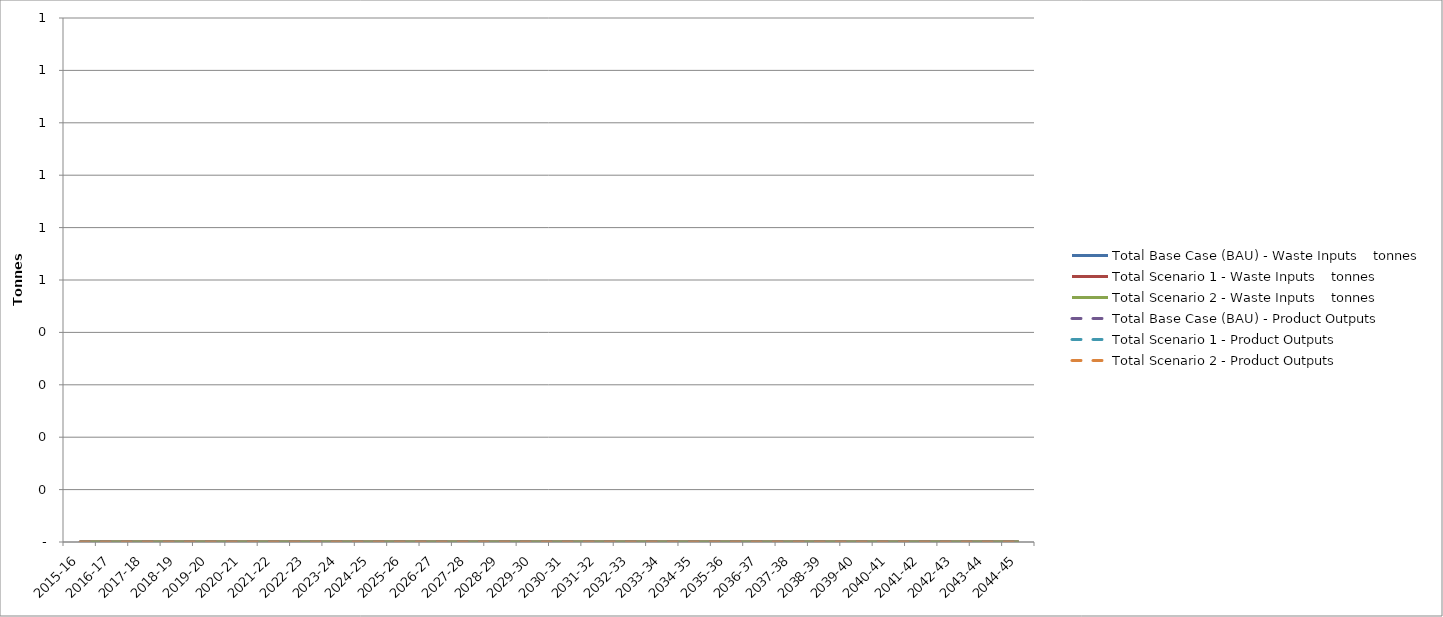
| Category | Total Base Case (BAU) - Waste Inputs | Total Scenario 1 - Waste Inputs | Total Scenario 2 - Waste Inputs | Total Base Case (BAU) - Product Outputs | Total Scenario 1 - Product Outputs | Total Scenario 2 - Product Outputs |
|---|---|---|---|---|---|---|
| 2015-16 | 0 | 0 | 0 | 0 | 0 | 0 |
| 2016-17 | 0 | 0 | 0 | 0 | 0 | 0 |
| 2017-18 | 0 | 0 | 0 | 0 | 0 | 0 |
| 2018-19 | 0 | 0 | 0 | 0 | 0 | 0 |
| 2019-20 | 0 | 0 | 0 | 0 | 0 | 0 |
| 2020-21 | 0 | 0 | 0 | 0 | 0 | 0 |
| 2021-22 | 0 | 0 | 0 | 0 | 0 | 0 |
| 2022-23 | 0 | 0 | 0 | 0 | 0 | 0 |
| 2023-24 | 0 | 0 | 0 | 0 | 0 | 0 |
| 2024-25 | 0 | 0 | 0 | 0 | 0 | 0 |
| 2025-26 | 0 | 0 | 0 | 0 | 0 | 0 |
| 2026-27 | 0 | 0 | 0 | 0 | 0 | 0 |
| 2027-28 | 0 | 0 | 0 | 0 | 0 | 0 |
| 2028-29 | 0 | 0 | 0 | 0 | 0 | 0 |
| 2029-30 | 0 | 0 | 0 | 0 | 0 | 0 |
| 2030-31 | 0 | 0 | 0 | 0 | 0 | 0 |
| 2031-32 | 0 | 0 | 0 | 0 | 0 | 0 |
| 2032-33 | 0 | 0 | 0 | 0 | 0 | 0 |
| 2033-34 | 0 | 0 | 0 | 0 | 0 | 0 |
| 2034-35 | 0 | 0 | 0 | 0 | 0 | 0 |
| 2035-36 | 0 | 0 | 0 | 0 | 0 | 0 |
| 2036-37 | 0 | 0 | 0 | 0 | 0 | 0 |
| 2037-38 | 0 | 0 | 0 | 0 | 0 | 0 |
| 2038-39 | 0 | 0 | 0 | 0 | 0 | 0 |
| 2039-40 | 0 | 0 | 0 | 0 | 0 | 0 |
| 2040-41 | 0 | 0 | 0 | 0 | 0 | 0 |
| 2041-42 | 0 | 0 | 0 | 0 | 0 | 0 |
| 2042-43 | 0 | 0 | 0 | 0 | 0 | 0 |
| 2043-44 | 0 | 0 | 0 | 0 | 0 | 0 |
| 2044-45 | 0 | 0 | 0 | 0 | 0 | 0 |